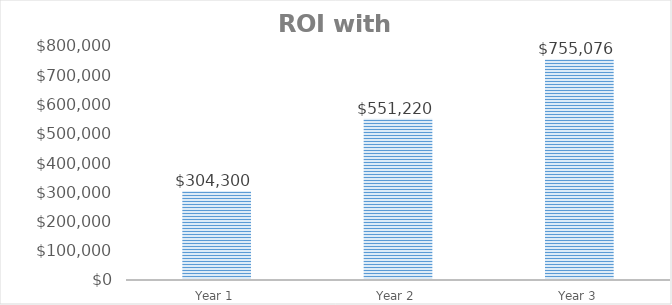
| Category | Series 0 |
|---|---|
| Year 1 | 304300 |
| Year 2 | 551220 |
| Year 3 | 755076.25 |